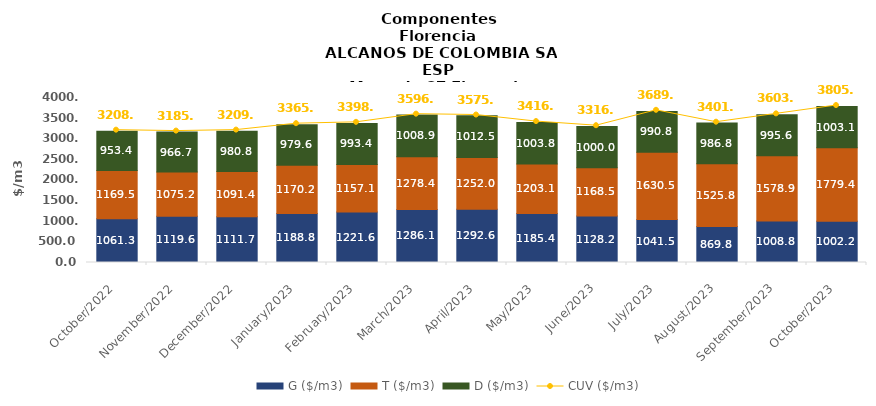
| Category | G ($/m3) | T ($/m3) | D ($/m3) |
|---|---|---|---|
| 2022-10-01 | 1061.27 | 1169.53 | 953.42 |
| 2022-11-01 | 1119.61 | 1075.19 | 966.69 |
| 2022-12-01 | 1111.69 | 1091.36 | 980.8 |
| 2023-01-01 | 1188.81 | 1170.15 | 979.57 |
| 2023-02-01 | 1221.59 | 1157.08 | 993.4 |
| 2023-03-01 | 1286.09 | 1278.38 | 1008.86 |
| 2023-04-01 | 1292.6 | 1251.95 | 1012.48 |
| 2023-05-01 | 1185.42 | 1203.07 | 1003.78 |
| 2023-06-01 | 1128.21 | 1168.47 | 999.96 |
| 2023-07-01 | 1041.54 | 1630.51 | 990.77 |
| 2023-08-01 | 869.82 | 1525.81 | 986.78 |
| 2023-09-01 | 1008.82 | 1578.87 | 995.55 |
| 2023-10-01 | 1002.24 | 1779.41 | 1003.05 |